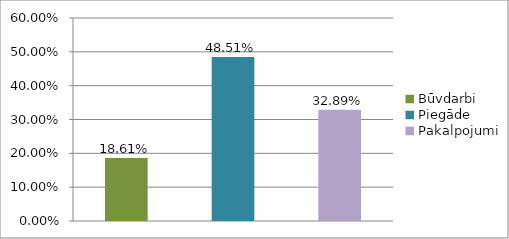
| Category | Series 0 |
|---|---|
| Būvdarbi | 0.186 |
| Piegāde | 0.485 |
| Pakalpojumi | 0.329 |